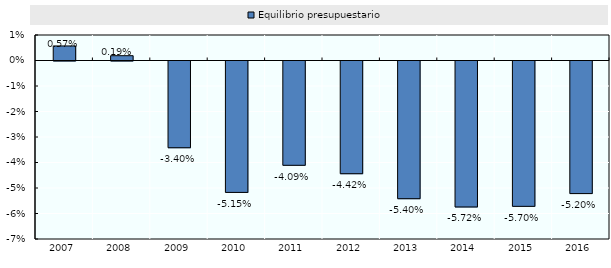
| Category | Equilibrio presupuestario |
|---|---|
| 2007.0 | 0.006 |
| 2008.0 | 0.002 |
| 2009.0 | -0.034 |
| 2010.0 | -0.052 |
| 2011.0 | -0.041 |
| 2012.0 | -0.044 |
| 2013.0 | -0.054 |
| 2014.0 | -0.057 |
| 2015.0 | -0.057 |
| 2016.0 | -0.052 |